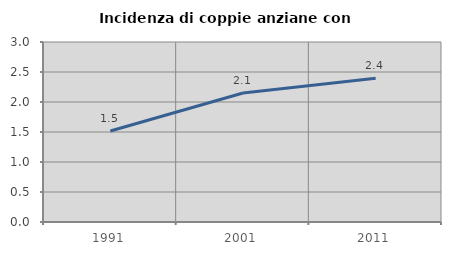
| Category | Incidenza di coppie anziane con figli |
|---|---|
| 1991.0 | 1.517 |
| 2001.0 | 2.149 |
| 2011.0 | 2.398 |